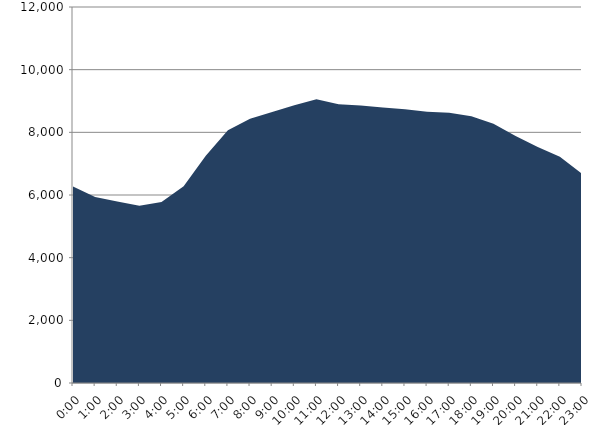
| Category | Series 0 | Series 1 |
|---|---|---|
| 2020-07-15 |  | 6271.494 |
| 2020-07-15 01:00:00 |  | 5938.319 |
| 2020-07-15 02:00:00 |  | 5795.922 |
| 2020-07-15 03:00:00 |  | 5653.428 |
| 2020-07-15 04:00:00 |  | 5773.447 |
| 2020-07-15 05:00:00 |  | 6280.489 |
| 2020-07-15 06:00:00 |  | 7253.653 |
| 2020-07-15 07:00:00 |  | 8062.758 |
| 2020-07-15 08:00:00 |  | 8435.5 |
| 2020-07-15 09:00:00 |  | 8645.034 |
| 2020-07-15 10:00:00 |  | 8862.452 |
| 2020-07-15 11:00:00 |  | 9054.194 |
| 2020-07-15 12:00:00 |  | 8893.969 |
| 2020-07-15 13:00:00 |  | 8852.762 |
| 2020-07-15 14:00:00 |  | 8791.6 |
| 2020-07-15 15:00:00 |  | 8737.567 |
| 2020-07-15 16:00:00 |  | 8654.82 |
| 2020-07-15 17:00:00 |  | 8621.653 |
| 2020-07-15 18:00:00 |  | 8515.182 |
| 2020-07-15 19:00:00 |  | 8272.305 |
| 2020-07-15 20:00:00 |  | 7880.08 |
| 2020-07-15 21:00:00 |  | 7529.694 |
| 2020-07-15 22:00:00 |  | 7216.941 |
| 2020-07-15 23:00:00 |  | 6675.867 |